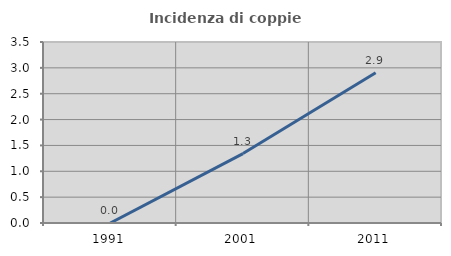
| Category | Incidenza di coppie miste |
|---|---|
| 1991.0 | 0 |
| 2001.0 | 1.342 |
| 2011.0 | 2.905 |